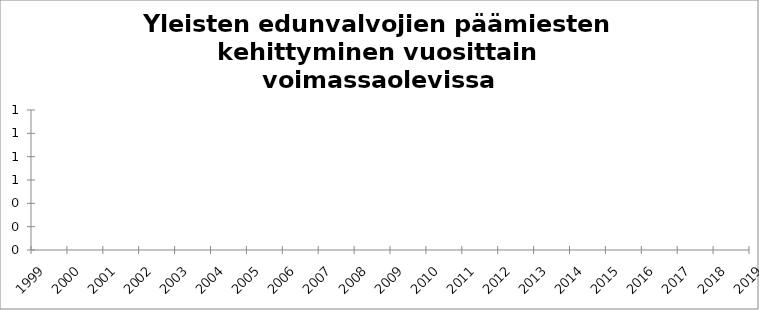
| Category | Series 0 |
|---|---|
| 1999 | 7798 |
| 2000 | 9353 |
| 2001 | 11178 |
| 2002 | 13262 |
| 2003 | 15555 |
| 2004 | 18309 |
| 2005 | 21148 |
| 2006 | 24286 |
| 2007 | 27610 |
| 2008 | 31415 |
| 2009 | 29954 |
| 2010 | 30018 |
| 2011 | 29965 |
| 2012 | 29991 |
| 2013 | 30835 |
| 2014 | 31167 |
| 2015 | 31496 |
| 2016 | 32207 |
| 2017 | 33099 |
| 2018 | 34097 |
| 2019 | 35060 |